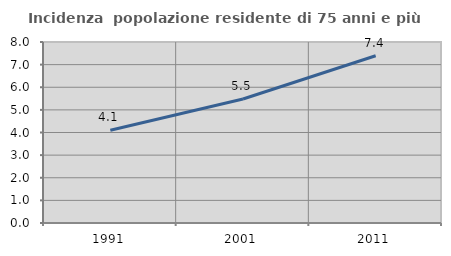
| Category | Incidenza  popolazione residente di 75 anni e più |
|---|---|
| 1991.0 | 4.102 |
| 2001.0 | 5.481 |
| 2011.0 | 7.39 |